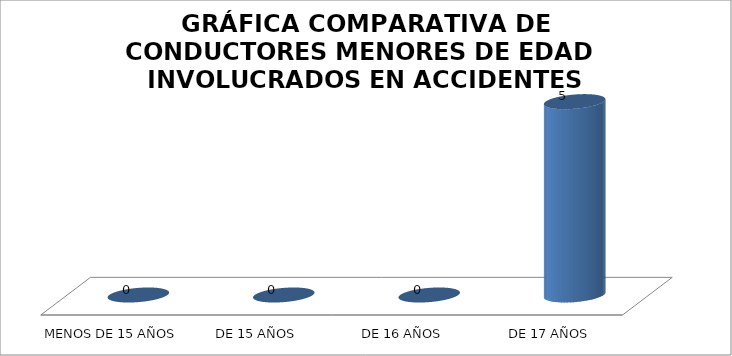
| Category | Series 0 |
|---|---|
| MENOS DE 15 AÑOS | 0 |
| DE 15 AÑOS | 0 |
| DE 16 AÑOS | 0 |
|  DE 17 AÑOS | 5 |